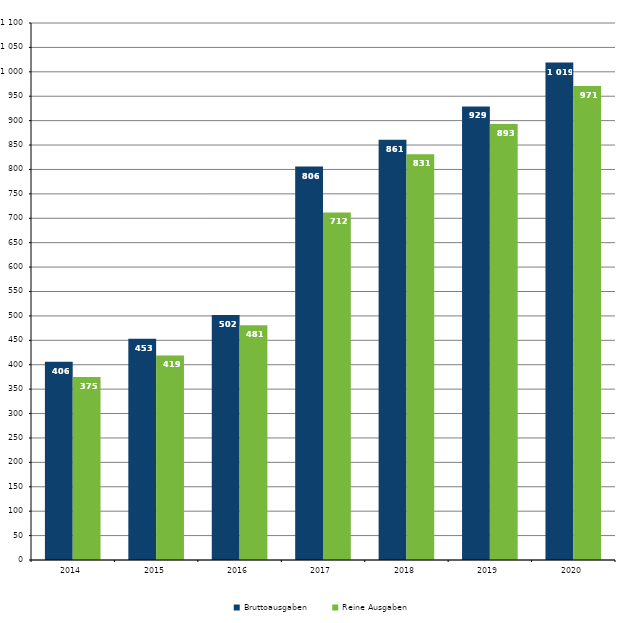
| Category | Bruttoausgaben | Reine Ausgaben |
|---|---|---|
| 2014.0 | 406 | 375 |
| 2015.0 | 453 | 419 |
| 2016.0 | 502 | 481 |
| 2017.0 | 806 | 712 |
| 2018.0 | 861 | 831 |
| 2019.0 | 929 | 893 |
| 2020.0 | 1019 | 971 |